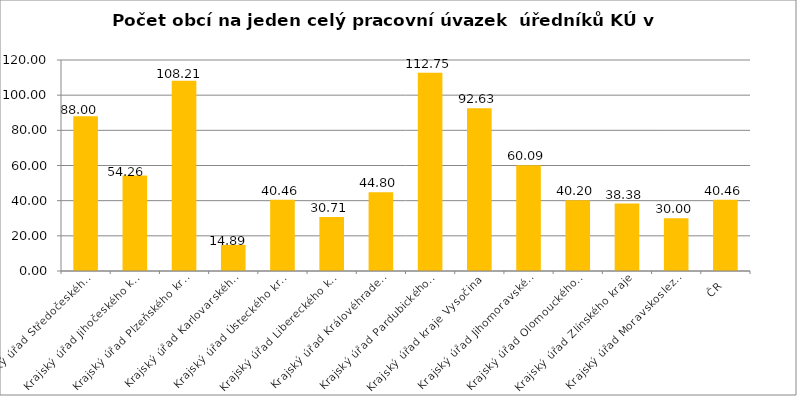
| Category | Počet obcí na jeden celý pracovní úvazek  úředníků KÚ |
|---|---|
| Krajský úřad Středočeského kraje | 88 |
| Krajský úřad Jihočeského kraje | 54.26 |
| Krajský úřad Plzeňského kraje | 108.21 |
| Krajský úřad Karlovarského kraje | 14.89 |
| Krajský úřad Ústeckého kraje | 40.46 |
| Krajský úřad Libereckého kraje | 30.71 |
| Krajský úřad Královéhradeckého kraje | 44.8 |
| Krajský úřad Pardubického kraje | 112.75 |
| Krajský úřad kraje Vysočina | 92.63 |
| Krajský úřad Jihomoravského kraje | 60.09 |
| Krajský úřad Olomouckého kraje | 40.2 |
| Krajský úřad Zlínského kraje | 38.38 |
| Krajský úřad Moravskoslezského kraje | 30 |
| ČR | 40.46 |